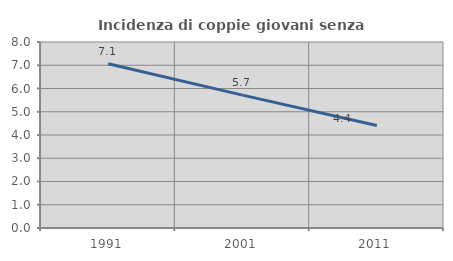
| Category | Incidenza di coppie giovani senza figli |
|---|---|
| 1991.0 | 7.063 |
| 2001.0 | 5.714 |
| 2011.0 | 4.408 |